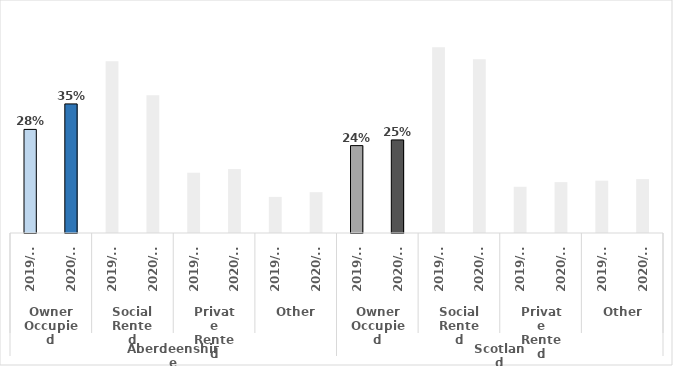
| Category | Series 0 |
|---|---|
| 0 | 0.279 |
| 1 | 0.347 |
| 2 | 0.462 |
| 3 | 0.371 |
| 4 | 0.162 |
| 5 | 0.172 |
| 6 | 0.097 |
| 7 | 0.11 |
| 8 | 0.235 |
| 9 | 0.25 |
| 10 | 0.5 |
| 11 | 0.468 |
| 12 | 0.124 |
| 13 | 0.137 |
| 14 | 0.141 |
| 15 | 0.145 |